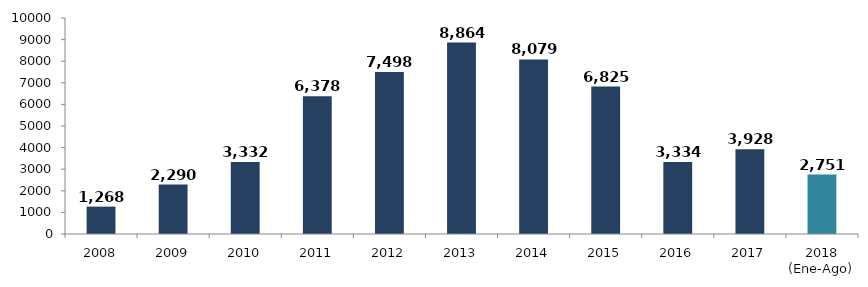
| Category | Series 0 |
|---|---|
| 2008 | 1267.813 |
| 2009 | 2290.273 |
| 2010 | 3331.554 |
| 2011 | 6377.615 |
| 2012 | 7498.207 |
| 2013 | 8863.622 |
| 2014 | 8079.21 |
| 2015 | 6824.624 |
| 2016 | 3333.564 |
| 2017 | 3928.017 |
| 2018 (Ene-Ago) | 2750.576 |